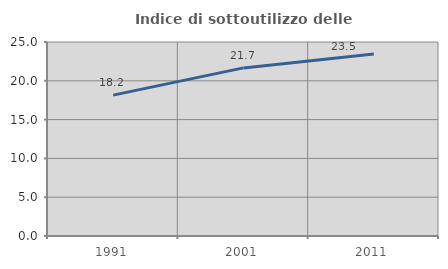
| Category | Indice di sottoutilizzo delle abitazioni  |
|---|---|
| 1991.0 | 18.154 |
| 2001.0 | 21.662 |
| 2011.0 | 23.46 |